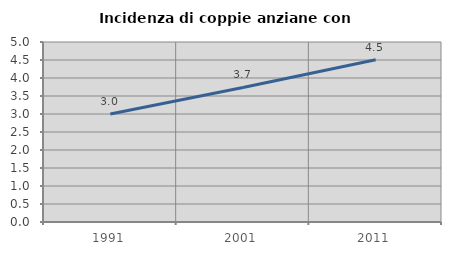
| Category | Incidenza di coppie anziane con figli |
|---|---|
| 1991.0 | 3 |
| 2001.0 | 3.738 |
| 2011.0 | 4.505 |